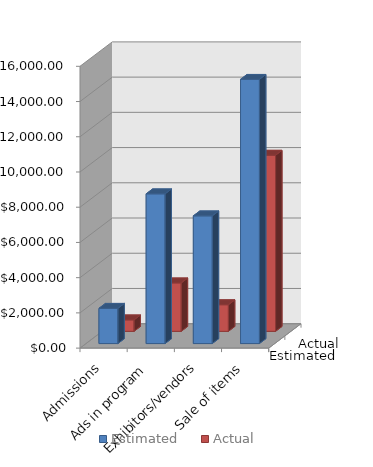
| Category | Estimated | Actual |
|---|---|---|
| Admissions | 2000 | 650 |
| Ads in program | 8500 | 2750 |
| Exhibitors/vendors | 7250 | 1510 |
| Sale of items | 15000 | 10000 |